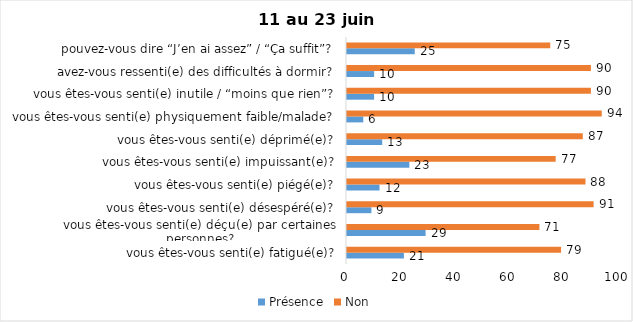
| Category | Présence | Non |
|---|---|---|
| vous êtes-vous senti(e) fatigué(e)? | 21 | 79 |
| vous êtes-vous senti(e) déçu(e) par certaines personnes? | 29 | 71 |
| vous êtes-vous senti(e) désespéré(e)? | 9 | 91 |
| vous êtes-vous senti(e) piégé(e)? | 12 | 88 |
| vous êtes-vous senti(e) impuissant(e)? | 23 | 77 |
| vous êtes-vous senti(e) déprimé(e)? | 13 | 87 |
| vous êtes-vous senti(e) physiquement faible/malade? | 6 | 94 |
| vous êtes-vous senti(e) inutile / “moins que rien”? | 10 | 90 |
| avez-vous ressenti(e) des difficultés à dormir? | 10 | 90 |
| pouvez-vous dire “J’en ai assez” / “Ça suffit”? | 25 | 75 |